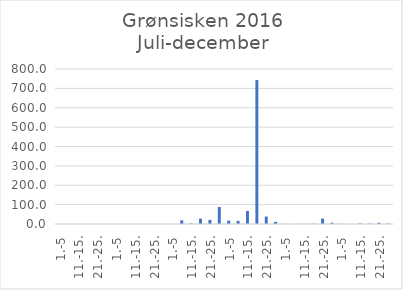
| Category | Series 0 |
|---|---|
| 1.-5 | 0 |
| 6.-10. | 0 |
| 11.-15. | 0 |
| 16.-20. | 0 |
| 21.-25. | 0 |
| 26.-31. | 0 |
| 1.-5 | 0 |
| 6.-10. | 0 |
| 11.-15. | 0 |
| 16.-20. | 0 |
| 21.-25. | 0 |
| 26.-31. | 0 |
| 1.-5 | 0 |
| 6.-10. | 19.025 |
| 11.-15. | 2.956 |
| 16.-20. | 27.367 |
| 21.-25. | 21.174 |
| 26.-30. | 87.909 |
| 1.-5 | 17.374 |
| 6.-10. | 16.143 |
| 11.-15. | 67.409 |
| 16.-20. | 742.929 |
| 21.-25. | 38.81 |
| 26.-31. | 11.114 |
| 1.-5 | 0.571 |
| 6.-10. | 0.053 |
| 11.-15. | 1.187 |
| 16.-20. | 1.207 |
| 21.-25. | 27.805 |
| 26.-30. | 6.374 |
| 1.-5 | 0.835 |
| 6.-10. | 0 |
| 11.-15. | 3.251 |
| 16.-20. | 1.969 |
| 21.-25. | 6.446 |
| 26.-31. | 1.947 |